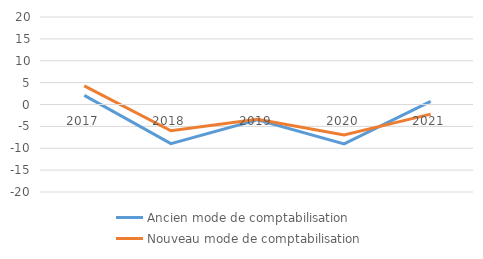
| Category | Ancien mode de comptabilisation | Nouveau mode de comptabilisation |
|---|---|---|
| 2017.0 | 2.073 | 4.24 |
| 2018.0 | -8.937 | -6.009 |
| 2019.0 | -3.516 | -3.366 |
| 2020.0 | -9.002 | -6.966 |
| 2021.0 | 0.717 | -2.199 |